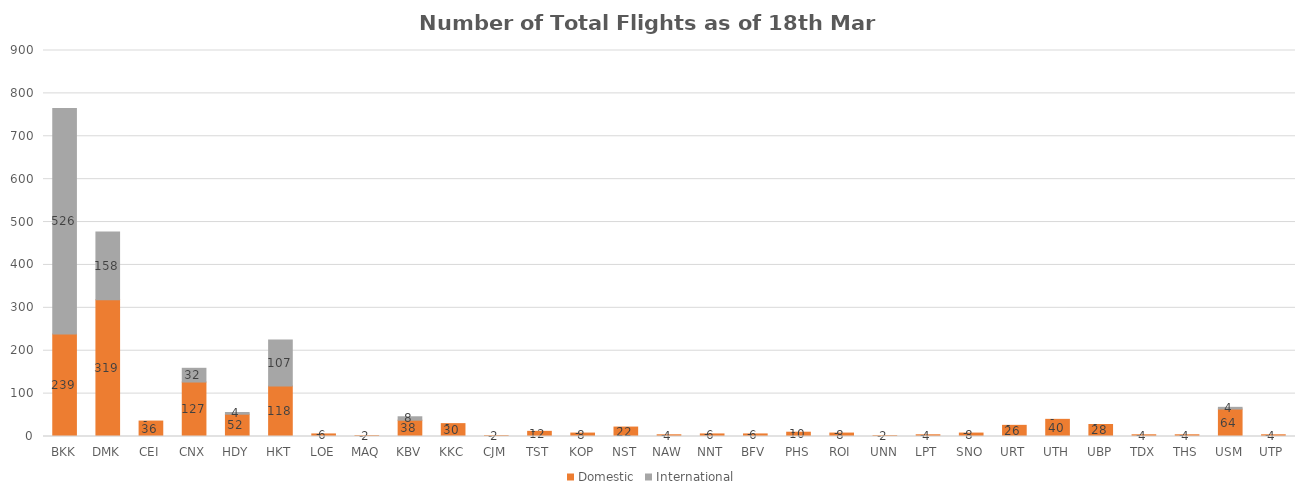
| Category | Domestic | International |
|---|---|---|
| BKK | 239 | 526 |
| DMK | 319 | 158 |
| CEI | 36 | 0 |
| CNX | 127 | 32 |
| HDY | 52 | 4 |
| HKT | 118 | 107 |
| LOE | 6 | 0 |
| MAQ | 2 | 0 |
| KBV | 38 | 8 |
| KKC | 30 | 0 |
| CJM | 2 | 0 |
| TST | 12 | 0 |
| KOP | 8 | 0 |
| NST | 22 | 0 |
| NAW | 4 | 0 |
| NNT | 6 | 0 |
| BFV | 6 | 0 |
| PHS | 10 | 0 |
| ROI | 8 | 0 |
| UNN | 2 | 0 |
| LPT | 4 | 0 |
| SNO | 8 | 0 |
| URT | 26 | 0 |
| UTH | 40 | 0 |
| UBP | 28 | 0 |
| TDX | 4 | 0 |
| THS | 4 | 0 |
| USM | 64 | 4 |
| UTP | 4 | 0 |